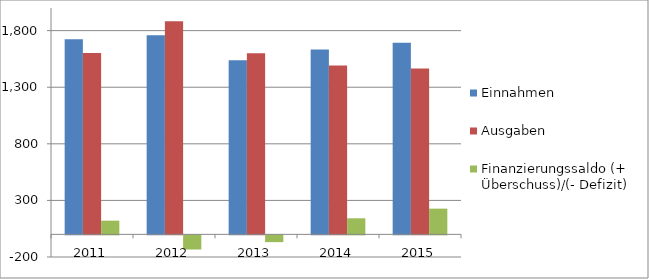
| Category | Einnahmen | Ausgaben | Finanzierungssaldo (+ Überschuss)/(- Defizit) |
|---|---|---|---|
| 2011.0 | 1723.9 | 1602.9 | 121.1 |
| 2012.0 | 1759 | 1883.9 | -124.9 |
| 2013.0 | 1539.4 | 1599.2 | -59.8 |
| 2014.0 | 1634 | 1491.9 | 142.1 |
| 2015.0 | 1692.6 | 1465.3 | 227.3 |